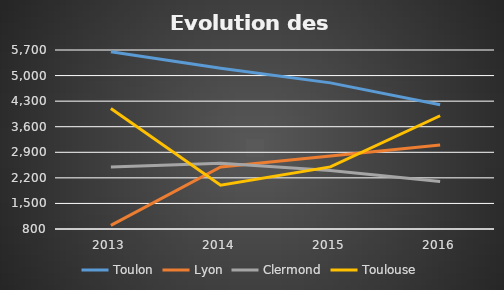
| Category | Toulon | Lyon | Clermond | Toulouse |
|---|---|---|---|---|
| 2013.0 | 5650 | 900 | 2500 | 4100 |
| 2014.0 | 5200 | 2500 | 2600 | 2000 |
| 2015.0 | 4800 | 2800 | 2400 | 2500 |
| 2016.0 | 4200 | 3100 | 2100 | 3900 |